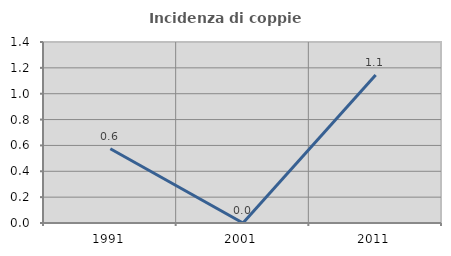
| Category | Incidenza di coppie miste |
|---|---|
| 1991.0 | 0.575 |
| 2001.0 | 0 |
| 2011.0 | 1.145 |